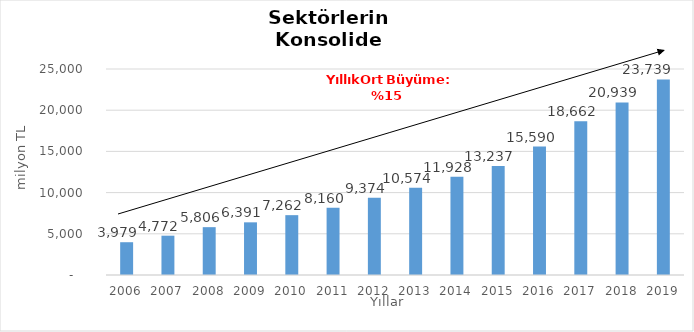
| Category | Toplam |
|---|---|
| 2006.0 | 3978.535 |
| 2007.0 | 4771.635 |
| 2008.0 | 5805.717 |
| 2009.0 | 6391.175 |
| 2010.0 | 7262.062 |
| 2011.0 | 8159.605 |
| 2012.0 | 9374.412 |
| 2013.0 | 10573.674 |
| 2014.0 | 11928 |
| 2015.0 | 13237 |
| 2016.0 | 15590 |
| 2017.0 | 18662 |
| 2018.0 | 20939 |
| 2019.0 | 23739 |